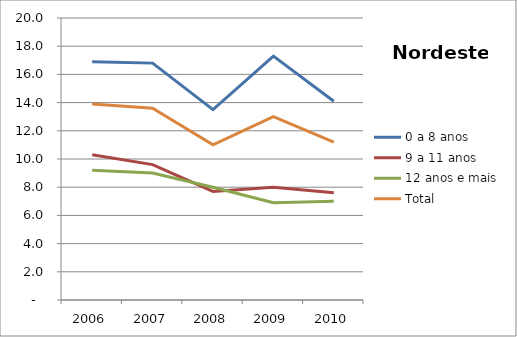
| Category | 0 a 8 anos | 9 a 11 anos | 12 anos e mais | Total |
|---|---|---|---|---|
| 2006.0 | 16.9 | 10.3 | 9.2 | 13.9 |
| 2007.0 | 16.8 | 9.6 | 9 | 13.6 |
| 2008.0 | 13.5 | 7.7 | 8 | 11 |
| 2009.0 | 17.3 | 8 | 6.9 | 13 |
| 2010.0 | 14.1 | 7.6 | 7 | 11.2 |